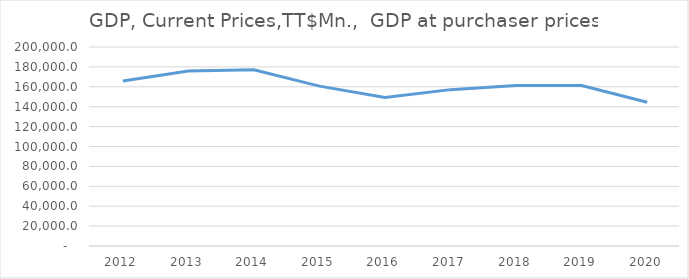
| Category | GDP at purchaser prices |
|---|---|
| 2012.0 | 165766.168 |
| 2013.0 | 175848.047 |
| 2014.0 | 177163.562 |
| 2015.0 | 160657.649 |
| 2016.0 | 149208.571 |
| 2017.0 | 157150.12 |
| 2018.0 | 161284.317 |
| 2019.0 | 161335.309 |
| 2020.0 | 144422.139 |